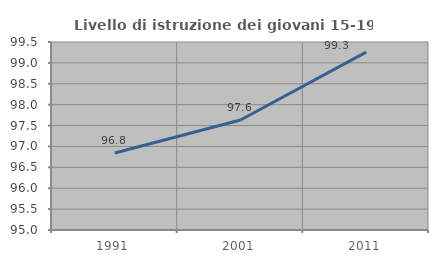
| Category | Livello di istruzione dei giovani 15-19 anni |
|---|---|
| 1991.0 | 96.842 |
| 2001.0 | 97.633 |
| 2011.0 | 99.259 |